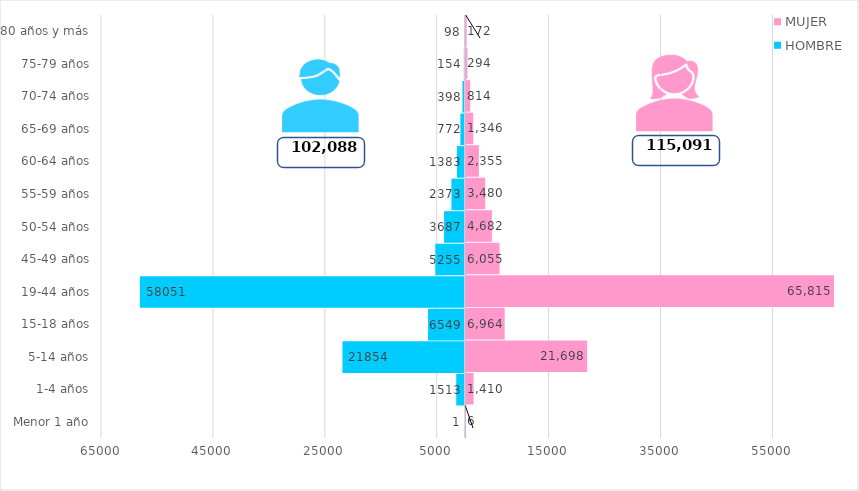
| Category | HOMBRE | MUJER |
|---|---|---|
| Menor 1 año | -1 | 6 |
| 1-4 años | -1513 | 1410 |
| 5-14 años | -21854 | 21698 |
| 15-18 años | -6549 | 6964 |
| 19-44 años | -58051 | 65815 |
| 45-49 años | -5255 | 6055 |
| 50-54 años | -3687 | 4682 |
| 55-59 años | -2373 | 3480 |
| 60-64 años | -1383 | 2355 |
| 65-69 años | -772 | 1346 |
| 70-74 años | -398 | 814 |
| 75-79 años | -154 | 294 |
| 80 años y más | -98 | 172 |